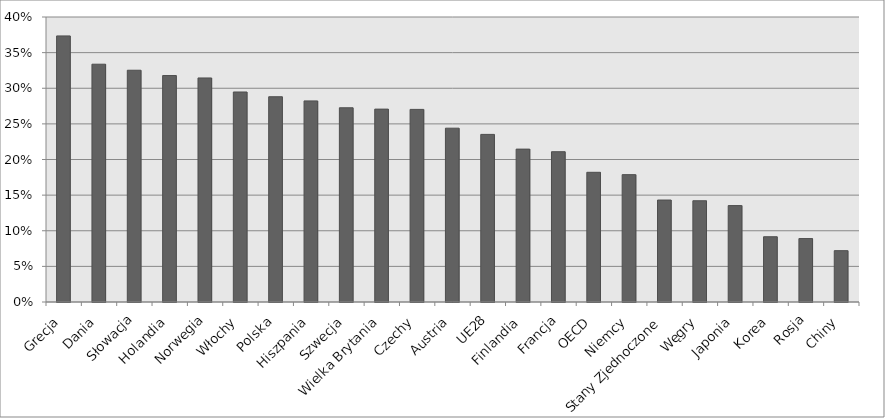
| Category | HERD/GERD (%) |
|---|---|
| Grecja | 0.373 |
| Dania | 0.334 |
| Słowacja | 0.325 |
| Holandia | 0.318 |
| Norwegia | 0.314 |
| Włochy | 0.295 |
| Polska | 0.288 |
| Hiszpania | 0.282 |
| Szwecja | 0.273 |
| Wielka Brytania | 0.271 |
| Czechy | 0.27 |
| Austria | 0.244 |
| UE28 | 0.235 |
| Finlandia | 0.215 |
| Francja | 0.211 |
| OECD | 0.182 |
| Niemcy | 0.179 |
| Stany Zjednoczone | 0.143 |
| Węgry | 0.142 |
| Japonia | 0.135 |
| Korea | 0.092 |
| Rosja | 0.089 |
| Chiny | 0.072 |